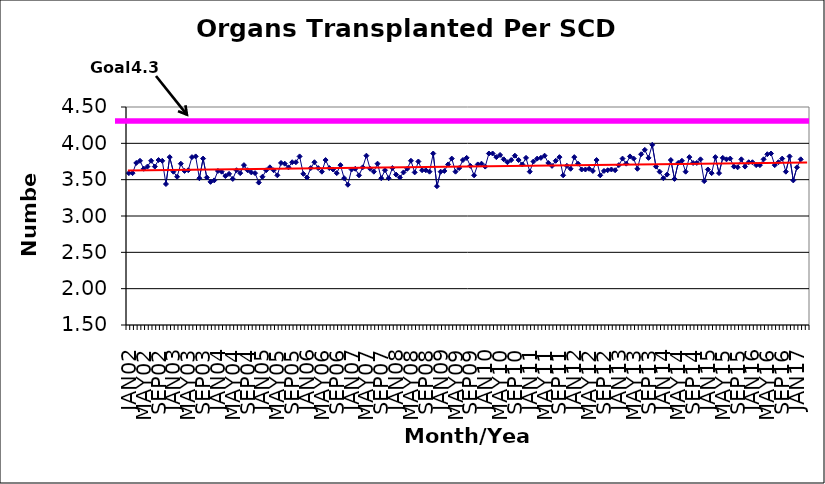
| Category | Series 0 |
|---|---|
| JAN02 | 3.59 |
| FEB02 | 3.59 |
| MAR02 | 3.73 |
| APR02 | 3.76 |
| MAY02 | 3.65 |
| JUN02 | 3.68 |
| JUL02 | 3.76 |
| AUG02 | 3.68 |
| SEP02 | 3.77 |
| OCT02 | 3.76 |
| NOV02 | 3.44 |
| DEC02 | 3.81 |
| JAN03 | 3.61 |
| FEB03 | 3.54 |
| MAR03 | 3.72 |
| APR03 | 3.62 |
| MAY03 | 3.63 |
| JUN03 | 3.81 |
| JUL03 | 3.82 |
| AUG03 | 3.52 |
| SEP03 | 3.79 |
| OCT03 | 3.53 |
| NOV03 | 3.47 |
| DEC03 | 3.49 |
| JAN04 | 3.62 |
| FEB04 | 3.61 |
| MAR04 | 3.55 |
| APR04 | 3.58 |
| MAY04 | 3.51 |
| JUN04 | 3.63 |
| JUL04 | 3.59 |
| AUG04 | 3.7 |
| SEP04 | 3.63 |
| OCT04 | 3.6 |
| NOV04 | 3.59 |
| DEC04 | 3.46 |
| JAN05 | 3.54 |
| FEB05 | 3.63 |
| MAR05 | 3.67 |
| APR05 | 3.63 |
| MAY05 | 3.56 |
| JUN05 | 3.73 |
| JUL05 | 3.72 |
| AUG05 | 3.67 |
| SEP05 | 3.74 |
| OCT05 | 3.74 |
| NOV05 | 3.82 |
| DEC05 | 3.58 |
| JAN06 | 3.53 |
| FEB06 | 3.66 |
| MAR06 | 3.74 |
| APR06 | 3.66 |
| MAY06 | 3.61 |
| JUN06 | 3.77 |
| JUL06 | 3.66 |
| AUG06 | 3.64 |
| SEP06 | 3.59 |
| OCT06 | 3.7 |
| NOV06 | 3.52 |
| DEC06 | 3.43 |
| JAN07 | 3.64 |
| FEB07 | 3.65 |
| MAR07 | 3.56 |
| APR07 | 3.67 |
| MAY07 | 3.83 |
| JUN07 | 3.65 |
| JUL07 | 3.61 |
| AUG07 | 3.72 |
| SEP07 | 3.52 |
| OCT07 | 3.63 |
| NOV07 | 3.52 |
| DEC07 | 3.66 |
| JAN08 | 3.57 |
| FEB08 | 3.53 |
| MAR08 | 3.6 |
| APR08 | 3.65 |
| MAY08 | 3.76 |
| JUN08 | 3.6 |
| JUL08 | 3.75 |
| AUG08 | 3.63 |
| SEP08 | 3.63 |
| OCT08 | 3.61 |
| NOV08 | 3.86 |
| DEC08 | 3.41 |
| JAN09 | 3.61 |
| FEB09 | 3.62 |
| MAR09 | 3.71 |
| APR09 | 3.79 |
| MAY09 | 3.61 |
| JUN09 | 3.66 |
| JUL09 | 3.77 |
| AUG09 | 3.8 |
| SEP09 | 3.69 |
| OCT09 | 3.56 |
| NOV09 | 3.71 |
| DEC09 | 3.72 |
| JAN10 | 3.68 |
| FEB10 | 3.86 |
| MAR10 | 3.86 |
| APR10 | 3.81 |
| MAY10 | 3.84 |
| JUN10 | 3.78 |
| JUL10 | 3.74 |
| AUG10 | 3.77 |
| SEP10 | 3.83 |
| OCT10 | 3.77 |
| NOV10 | 3.71 |
| DEC10 | 3.8 |
| JAN11 | 3.61 |
| FEB11 | 3.75 |
| MAR11 | 3.79 |
| APR11 | 3.8 |
| MAY11 | 3.83 |
| JUN11 | 3.73 |
| JUL11 | 3.69 |
| AUG11 | 3.76 |
| SEP11 | 3.81 |
| OCT11 | 3.56 |
| NOV11 | 3.69 |
| DEC11 | 3.65 |
| JAN12 | 3.81 |
| FEB12 | 3.72 |
| MAR12 | 3.64 |
| APR12 | 3.64 |
| MAY12 | 3.65 |
| JUN12 | 3.62 |
| JUL12 | 3.77 |
| AUG12 | 3.56 |
| SEP12 | 3.62 |
| OCT12 | 3.63 |
| NOV12 | 3.64 |
| DEC12 | 3.63 |
| JAN13 | 3.7 |
| FEB13 | 3.79 |
| MAR13 | 3.72 |
| APR13 | 3.82 |
| MAY13 | 3.79 |
| JUN13 | 3.65 |
| JUL13 | 3.85 |
| AUG13 | 3.91 |
| SEP13 | 3.8 |
| OCT13 | 3.98 |
| NOV13 | 3.68 |
| DEC13 | 3.61 |
| JAN14 | 3.52 |
| FEB14 | 3.57 |
| MAR14 | 3.77 |
| APR14 | 3.51 |
| MAY14 | 3.73 |
| JUN14 | 3.76 |
| JUL14 | 3.61 |
| AUG14 | 3.81 |
| SEP14 | 3.73 |
| OCT14 | 3.73 |
| NOV14 | 3.78 |
| DEC14 | 3.48 |
| JAN15 | 3.64 |
| FEB15 | 3.59 |
| MAR15 | 3.81 |
| APR15 | 3.59 |
| MAY15 | 3.8 |
| JUN15 | 3.78 |
| JUL15 | 3.79 |
| AUG15 | 3.68 |
| SEP15 | 3.67 |
| OCT15 | 3.78 |
| NOV15 | 3.68 |
| DEC15 | 3.74 |
| JAN16 | 3.74 |
| FEB16 | 3.7 |
| MAR16 | 3.7 |
| APR16 | 3.78 |
| MAY16 | 3.85 |
| JUN16 | 3.86 |
| JUL16 | 3.7 |
| AUG16 | 3.74 |
| SEP16 | 3.79 |
| OCT16 | 3.61 |
| NOV16 | 3.82 |
| DEC16 | 3.49 |
| JAN17 | 3.67 |
| FEB17 | 3.78 |